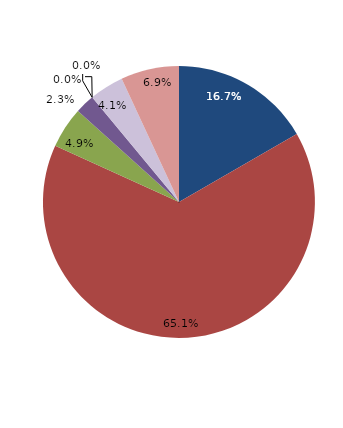
| Category | Series 0 |
|---|---|
| قبل الدخول | 16.667 |
| -1 | 65.128 |
| 1 | 4.872 |
| 2 | 2.308 |
| 3 | 0 |
| 4 | 0 |
|  5 - 9 | 4.103 |
| 10 - 14 | 6.923 |